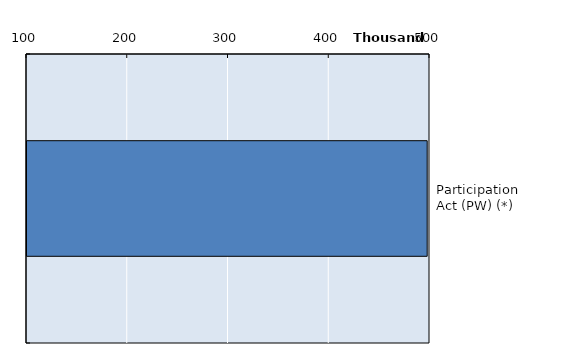
| Category | Series 0 |
|---|---|
| Participation Act (PW) (*) | 497205.8 |